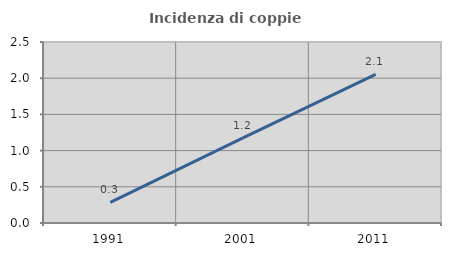
| Category | Incidenza di coppie miste |
|---|---|
| 1991.0 | 0.285 |
| 2001.0 | 1.176 |
| 2011.0 | 2.053 |